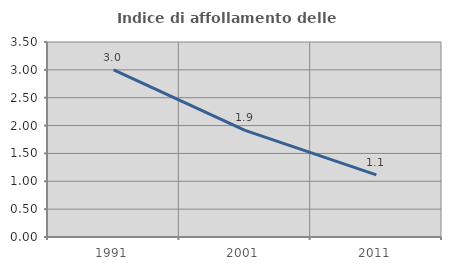
| Category | Indice di affollamento delle abitazioni  |
|---|---|
| 1991.0 | 2.998 |
| 2001.0 | 1.913 |
| 2011.0 | 1.116 |